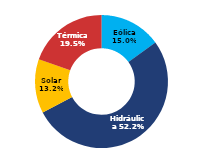
| Category | Sur |
|---|---|
| Eólica | 77.059 |
| Hidráulica | 267.671 |
| Solar | 67.536 |
| Térmica | 100.175 |